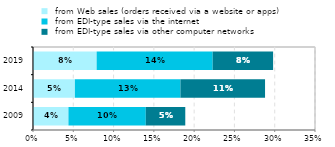
| Category |  from Web sales (orders received via a website or apps) |  from EDI-type sales via the internet |  from EDI-type sales via other computer networks |
|---|---|---|---|
| 2009.0 | 0.044 | 0.096 | 0.049 |
| 2014.0 | 0.052 | 0.131 | 0.105 |
| 2019.0 | 0.079 | 0.144 | 0.075 |